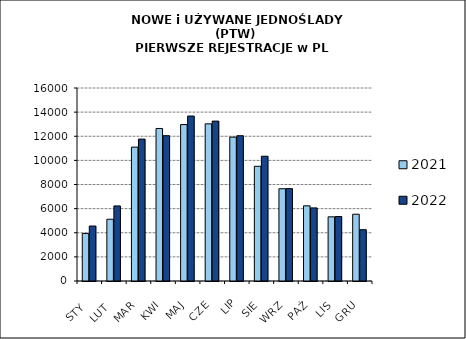
| Category | 2021 | 2022 |
|---|---|---|
|  STY  | 3942 | 4557 |
|  LUT  | 5120 | 6222 |
| MAR | 11099 | 11764 |
| KWI | 12644 | 12045 |
| MAJ | 12970 | 13675 |
| CZE | 13029 | 13254 |
| LIP | 11926 | 12043 |
| SIE | 9511 | 10344 |
| WRZ | 7650 | 7657 |
| PAŹ | 6231 | 6059 |
| LIS | 5319 | 5346 |
| GRU | 5536 | 4253 |